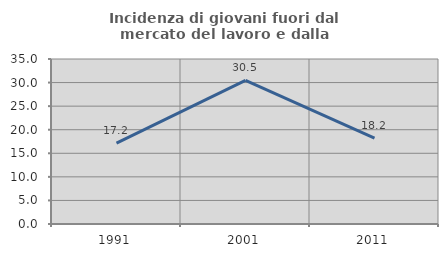
| Category | Incidenza di giovani fuori dal mercato del lavoro e dalla formazione  |
|---|---|
| 1991.0 | 17.175 |
| 2001.0 | 30.485 |
| 2011.0 | 18.234 |